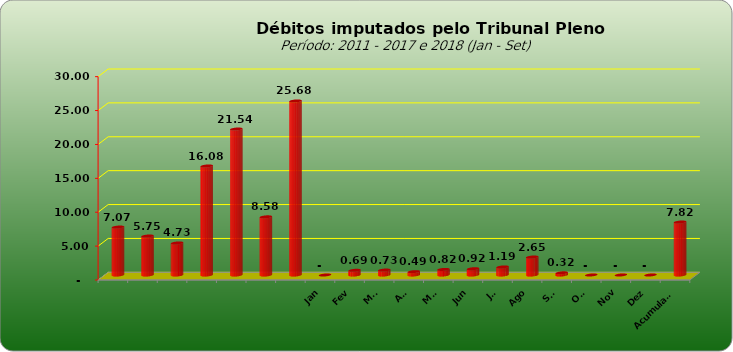
| Category |  7.073.154,74  |
|---|---|
|  | 7073154.74 |
|  | 5749129.25 |
|  | 4727033.51 |
|  | 16081820.48 |
|  | 21535723.6 |
|  | 8578266.09 |
|  | 25676499.17 |
| Jan | 0 |
| Fev | 689867.86 |
| Mar | 729624.1 |
| Abr | 491509.68 |
| Mai | 824303.32 |
| Jun | 924019.84 |
| Jul | 1188655.7 |
| Ago | 2651249.45 |
| Set | 319560.5 |
| Out | 0 |
| Nov | 0 |
| Dez | 0 |
| Acumulado | 7816158 |